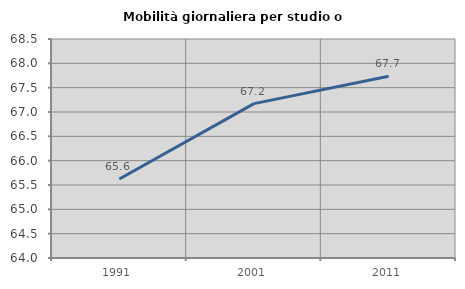
| Category | Mobilità giornaliera per studio o lavoro |
|---|---|
| 1991.0 | 65.622 |
| 2001.0 | 67.172 |
| 2011.0 | 67.736 |